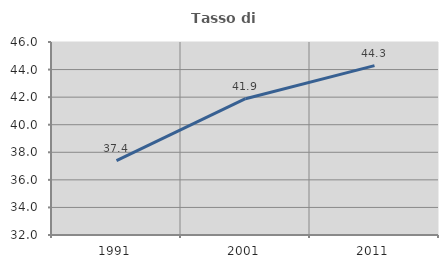
| Category | Tasso di occupazione   |
|---|---|
| 1991.0 | 37.393 |
| 2001.0 | 41.887 |
| 2011.0 | 44.289 |